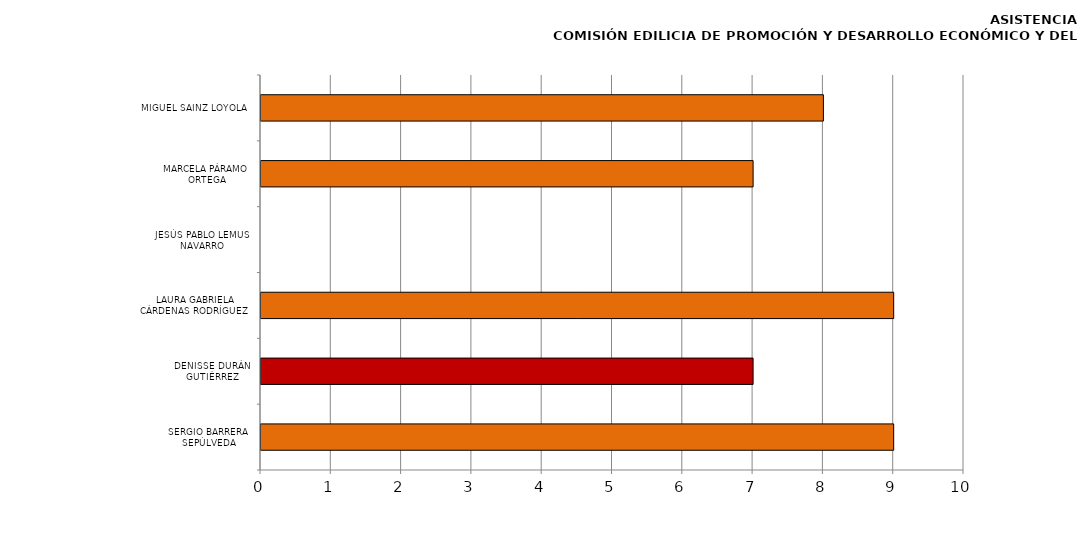
| Category | Series 0 |
|---|---|
| SERGIO BARRERA SEPÚLVEDA | 9 |
| DENISSE DURÁN GUTIÉRREZ | 7 |
| LAURA GABRIELA CÁRDENAS RODRÍGUEZ | 9 |
| JESÚS PABLO LEMUS NAVARRO | 0 |
| MARCELA PÁRAMO ORTEGA | 7 |
| MIGUEL SAINZ LOYOLA | 8 |